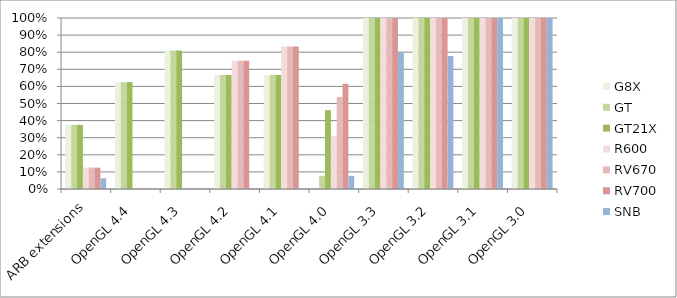
| Category | G8X | GT | GT21X | R600 | RV670 | RV700 | SNB |
|---|---|---|---|---|---|---|---|
| ARB extensions | 0.375 | 0.375 | 0.375 | 0.125 | 0.125 | 0.125 | 0.062 |
| OpenGL 4.4 | 0.625 | 0.625 | 0.625 | 0 | 0 | 0 | 0 |
| OpenGL 4.3 | 0.81 | 0.81 | 0.81 | 0 | 0 | 0 | 0 |
| OpenGL 4.2 | 0.667 | 0.667 | 0.667 | 0.75 | 0.75 | 0.75 | 0 |
| OpenGL 4.1 | 0.667 | 0.667 | 0.667 | 0.833 | 0.833 | 0.833 | 0 |
| OpenGL 4.0 | 0 | 0.077 | 0.462 | 0.308 | 0.538 | 0.615 | 0.077 |
| OpenGL 3.3 | 1 | 1 | 1 | 1 | 1 | 1 | 0.8 |
| OpenGL 3.2 | 1 | 1 | 1 | 1 | 1 | 1 | 0.778 |
| OpenGL 3.1 | 1 | 1 | 1 | 1 | 1 | 1 | 1 |
| OpenGL 3.0 | 1 | 1 | 1 | 1 | 1 | 1 | 1 |